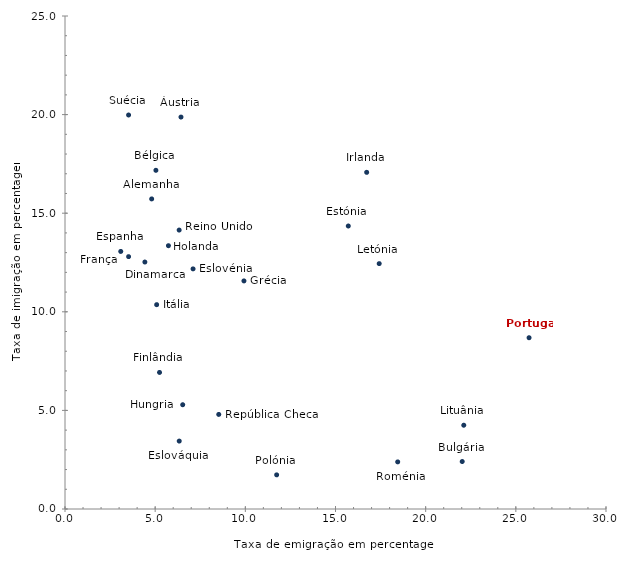
| Category | Series 0 |
|---|---|
| 4.806447594021077 | 15.724 |
| 6.431529199779075 | 19.875 |
| 5.041368093531963 | 17.175 |
| 22.026196983222714 | 2.407 |
| 4.428646769265313 | 12.524 |
| 6.3346559738816826 | 3.445 |
| 7.100412093595183 | 12.177 |
| 3.0916595530680167 | 13.061 |
| 15.709826439597842 | 14.351 |
| 5.24218767511256 | 6.925 |
| 3.5260918025022305 | 12.797 |
| 9.922771425475165 | 11.566 |
| 5.73636043008388 | 13.352 |
| 6.527072296355924 | 5.287 |
| 16.729090352371074 | 17.073 |
| 5.083027560246622 | 10.361 |
| 17.42342832778198 | 12.444 |
| 22.11251738006622 | 4.248 |
| 11.737257787262633 | 1.731 |
| 25.73353098276024 | 8.685 |
| 6.330500683457463 | 14.145 |
| 8.526243616342425 | 4.796 |
| 18.45017162024414 | 2.389 |
| 3.525424856913036 | 19.979 |